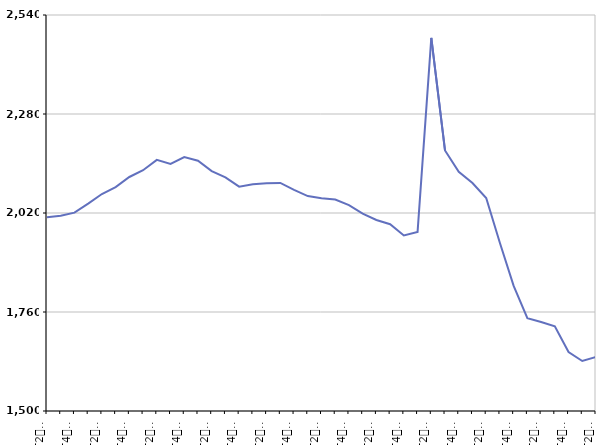
| Category | De 25 à 49 ans |
|---|---|
| T2
2013 | 2008.8 |
| T3
2013 | 2012.9 |
| T4
2013 | 2021 |
| T1
2014 | 2044.8 |
| T2
2014 | 2069.8 |
| T3
2014 | 2088.1 |
| T4
2014 | 2114.6 |
| T1
2015 | 2132.4 |
| T2
2015 | 2159.5 |
| T3
2015 | 2148.7 |
| T4
2015 | 2166.8 |
| T1
2016 | 2157.4 |
| T2
2016 | 2130.1 |
| T3
2016 | 2113.4 |
| T4
2016 | 2089.1 |
| T1
2017 | 2095.6 |
| T2
2017 | 2098.3 |
| T3
2017 | 2099 |
| T4
2017 | 2080.9 |
| T1
2018 | 2064.5 |
| T2
2018 | 2058.6 |
| T3
2018 | 2055.4 |
| T4
2018 | 2040.9 |
| T1
2019 | 2018.5 |
| T2
2019 | 2001.7 |
| T3
2019 | 1990.4 |
| T4
2019 | 1960.9 |
| T1
2020 | 1970.5 |
| T2
2020 | 2480 |
| T3
2020 | 2184.1 |
| T4
2020 | 2128.2 |
| T1
2021 | 2098.8 |
| T2
2021 | 2059.4 |
| T3
2021 | 1941.2 |
| T4
2021 | 1828.6 |
| T1
2022 | 1744 |
| T2
2022 | 1733.9 |
| T3
2022 | 1722.3 |
| T4
2022 | 1654.8 |
| T1
2023 | 1631.4 |
| T2
2023 | 1641.8 |